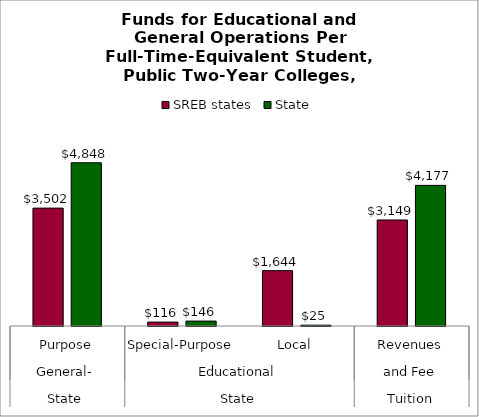
| Category | SREB states | State |
|---|---|---|
| 0 | 3501.571 | 4847.778 |
| 1 | 116.014 | 146.119 |
| 2 | 1644.002 | 25.283 |
| 3 | 3149.499 | 4177.001 |